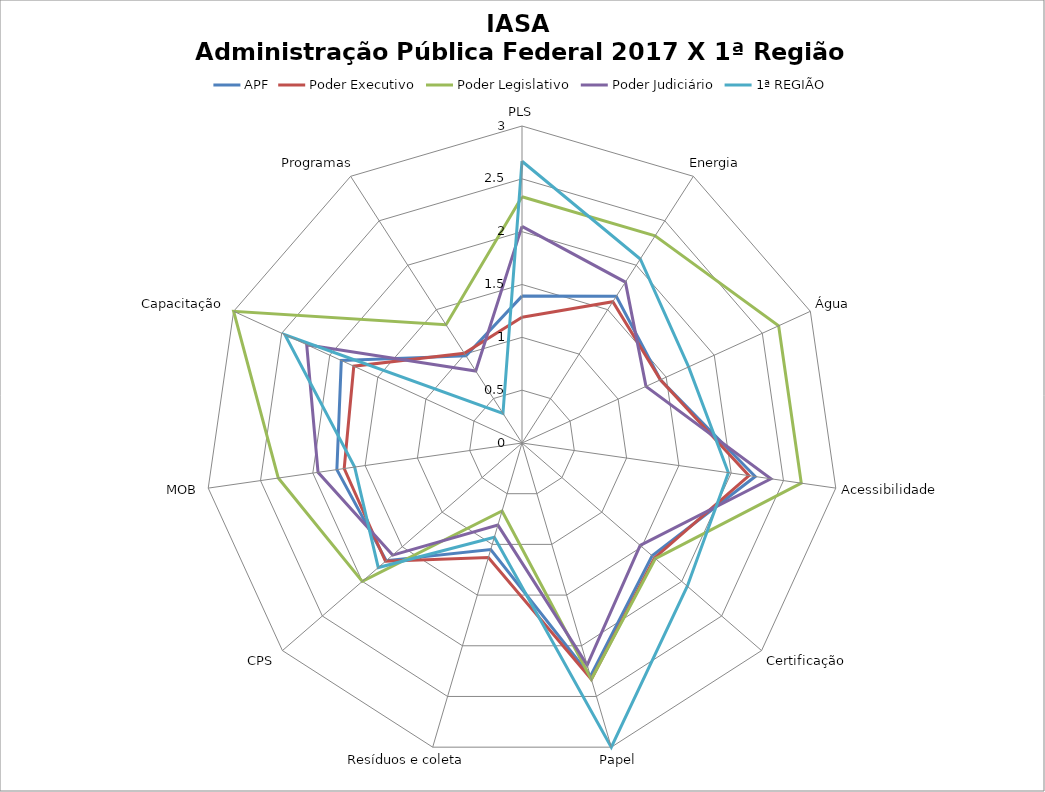
| Category | APF | Poder Executivo | Poder Legislativo | Poder Judiciário | 1ª REGIÃO |
|---|---|---|---|---|---|
| PLS | 1.39 | 1.19 | 2.33 | 2.05 | 2.667 |
| Energia | 1.65 | 1.59 | 2.33 | 1.81 | 2.07 |
| Água | 1.44 | 1.44 | 2.67 | 1.29 | 1.733 |
| Acessibilidade | 2.23 | 2.17 | 2.67 | 2.38 | 1.973 |
| Certificação | 1.63 | 1.66 | 1.67 | 1.48 | 2.07 |
| Papel | 2.3 | 2.33 | 2.33 | 2.19 | 3 |
| Resíduos e coleta | 1.05 | 1.13 | 0.67 | 0.81 | 0.93 |
| CPS | 1.7 | 1.71 | 2 | 1.62 | 1.8 |
| MOB | 1.77 | 1.7 | 2.33 | 1.95 | 1.6 |
| Capacitação | 1.88 | 1.75 | 3 | 2.24 | 2.467 |
| Programas | 0.98 | 1.01 | 1.33 | 0.81 | 0.333 |